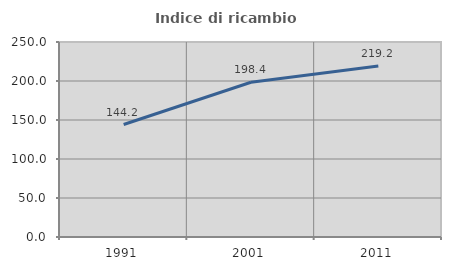
| Category | Indice di ricambio occupazionale  |
|---|---|
| 1991.0 | 144.175 |
| 2001.0 | 198.381 |
| 2011.0 | 219.237 |